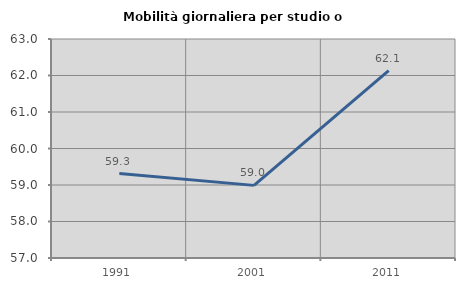
| Category | Mobilità giornaliera per studio o lavoro |
|---|---|
| 1991.0 | 59.314 |
| 2001.0 | 58.99 |
| 2011.0 | 62.134 |